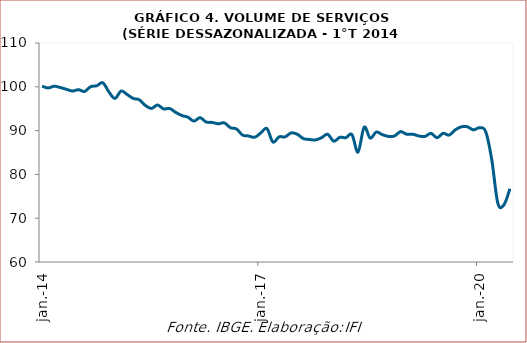
| Category | Volume de serviços |
|---|---|
| 2014-01-01 | 100.133 |
| 2014-02-01 | 99.734 |
| 2014-03-01 | 100.133 |
| 2014-04-01 | 99.834 |
| 2014-05-01 | 99.435 |
| 2014-06-01 | 99.037 |
| 2014-07-01 | 99.336 |
| 2014-08-01 | 98.937 |
| 2014-09-01 | 100.033 |
| 2014-10-01 | 100.232 |
| 2014-11-01 | 100.93 |
| 2014-12-01 | 98.838 |
| 2015-01-01 | 97.343 |
| 2015-02-01 | 99.037 |
| 2015-03-01 | 98.24 |
| 2015-04-01 | 97.343 |
| 2015-05-01 | 97.044 |
| 2015-06-01 | 95.749 |
| 2015-07-01 | 95.051 |
| 2015-08-01 | 95.849 |
| 2015-09-01 | 94.952 |
| 2015-10-01 | 95.051 |
| 2015-11-01 | 94.155 |
| 2015-12-01 | 93.457 |
| 2016-01-01 | 93.059 |
| 2016-02-01 | 92.162 |
| 2016-03-01 | 92.959 |
| 2016-04-01 | 91.963 |
| 2016-05-01 | 91.863 |
| 2016-06-01 | 91.564 |
| 2016-07-01 | 91.764 |
| 2016-08-01 | 90.668 |
| 2016-09-01 | 90.369 |
| 2016-10-01 | 88.974 |
| 2016-11-01 | 88.774 |
| 2016-12-01 | 88.476 |
| 2017-01-01 | 89.472 |
| 2017-02-01 | 90.468 |
| 2017-03-01 | 87.38 |
| 2017-04-01 | 88.575 |
| 2017-05-01 | 88.575 |
| 2017-06-01 | 89.472 |
| 2017-07-01 | 89.173 |
| 2017-08-01 | 88.177 |
| 2017-09-01 | 87.977 |
| 2017-10-01 | 87.878 |
| 2017-11-01 | 88.376 |
| 2017-12-01 | 89.173 |
| 2018-01-01 | 87.579 |
| 2018-02-01 | 88.476 |
| 2018-03-01 | 88.376 |
| 2018-04-01 | 89.073 |
| 2018-05-01 | 85.088 |
| 2018-06-01 | 90.767 |
| 2018-07-01 | 88.276 |
| 2018-08-01 | 89.671 |
| 2018-09-01 | 89.073 |
| 2018-10-01 | 88.675 |
| 2018-11-01 | 88.774 |
| 2018-12-01 | 89.771 |
| 2019-01-01 | 89.173 |
| 2019-02-01 | 89.173 |
| 2019-03-01 | 88.774 |
| 2019-04-01 | 88.675 |
| 2019-05-01 | 89.372 |
| 2019-06-01 | 88.376 |
| 2019-07-01 | 89.372 |
| 2019-08-01 | 88.974 |
| 2019-09-01 | 90.169 |
| 2019-10-01 | 90.867 |
| 2019-11-01 | 90.867 |
| 2019-12-01 | 90.169 |
| 2020-01-01 | 90.668 |
| 2020-02-01 | 89.771 |
| 2020-03-01 | 83.394 |
| 2020-04-01 | 73.431 |
| 2020-05-01 | 73.032 |
| 2020-06-01 | 76.719 |